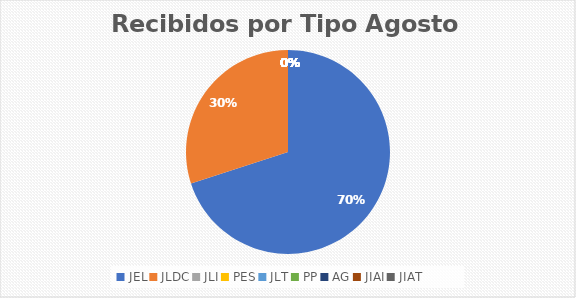
| Category | Series 0 |
|---|---|
| JEL | 7 |
| JLDC | 3 |
| JLI | 0 |
| PES | 0 |
| JLT | 0 |
| PP | 0 |
| AG | 0 |
| JIAI | 0 |
| JIAT | 0 |